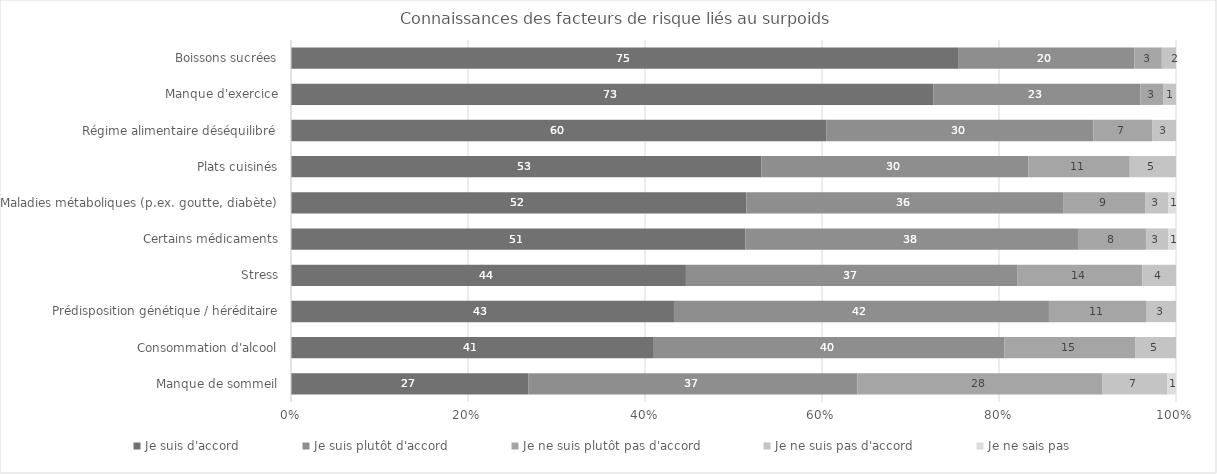
| Category | Je suis d'accord | Je suis plutôt d'accord | Je ne suis plutôt pas d'accord | Je ne suis pas d'accord | Je ne sais pas |
|---|---|---|---|---|---|
| Boissons sucrées | 75.3 | 19.9 | 3.1 | 1.6 | 0 |
| Manque d'exercice | 72.5 | 23.4 | 2.6 | 1.4 | 0 |
| Régime alimentaire déséquilibré | 60.4 | 30.1 | 6.6 | 2.7 | 0 |
| Plats cuisinés | 52.9 | 30 | 11.4 | 5.2 | 0 |
| Maladies métaboliques (p.ex. goutte, diabète) | 51.5 | 35.9 | 9.2 | 2.6 | 0.9 |
| Certains médicaments | 51.4 | 37.7 | 7.6 | 2.5 | 0.9 |
| Stress | 44.4 | 37.3 | 14 | 3.8 | 0 |
| Prédisposition génétique / héréditaire | 43.1 | 42.2 | 11 | 3.3 | 0 |
| Consommation d'alcool | 40.7 | 39.5 | 14.7 | 4.6 | 0 |
| Manque de sommeil | 26.8 | 37.2 | 27.7 | 7.3 | 1 |